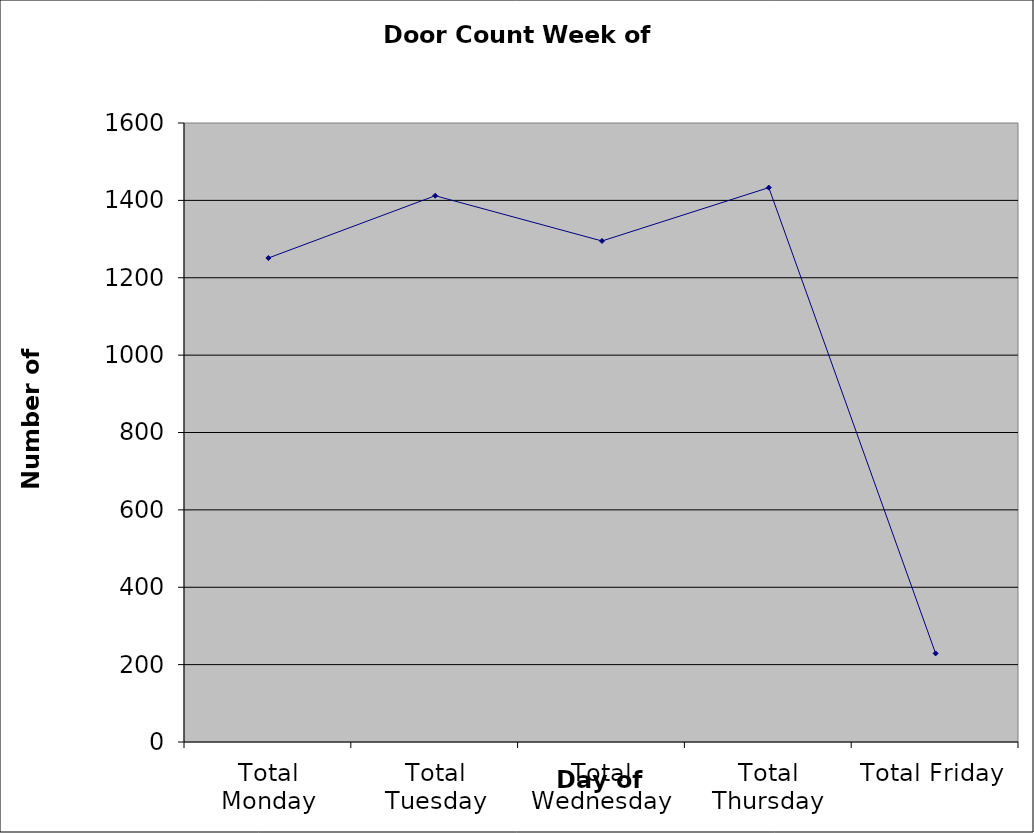
| Category | Series 0 |
|---|---|
| Total Monday | 1251 |
| Total Tuesday | 1412 |
| Total Wednesday | 1295 |
| Total Thursday | 1433 |
| Total Friday | 229 |